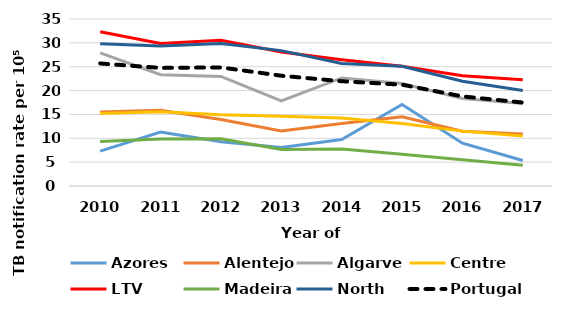
| Category | Azores | Alentejo | Algarve | Centre | LTV | Madeira | North | Portugal |
|---|---|---|---|---|---|---|---|---|
| 2010.0 | 7.295 | 15.492 | 27.919 | 15.209 | 32.326 | 9.33 | 29.787 | 25.68 |
| 2011.0 | 11.327 | 15.865 | 23.311 | 15.564 | 29.889 | 9.84 | 29.342 | 24.75 |
| 2012.0 | 9.291 | 13.948 | 22.953 | 14.953 | 30.523 | 9.883 | 29.846 | 24.85 |
| 2013.0 | 8.083 | 11.509 | 17.859 | 14.638 | 28.099 | 7.654 | 28.374 | 23.11 |
| 2014.0 | 9.742 | 13.119 | 22.652 | 14.226 | 26.462 | 7.731 | 25.665 | 21.96 |
| 2015.0 | 17.089 | 14.519 | 21.497 | 13.099 | 25.104 | 6.63 | 25.098 | 21.23 |
| 2016.0 | 8.969 | 11.499 | 18.348 | 11.5 | 23.112 | 5.493 | 21.939 | 18.78 |
| 2017.0 | 5.331 | 10.886 | 17.288 | 10.455 | 22.259 | 4.324 | 20.021 | 17.49 |